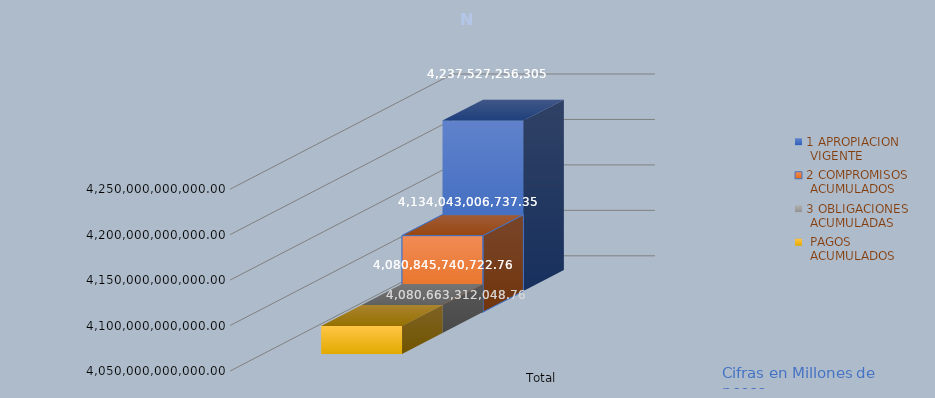
| Category | 1 APROPIACION
 VIGENTE | 2 COMPROMISOS
 ACUMULADOS | 3 OBLIGACIONES
 ACUMULADAS |  PAGOS
 ACUMULADOS |
|---|---|---|---|---|
| Total | 4237527256305 | 4134043006737.35 | 4080845740722.76 | 4080663312048.76 |